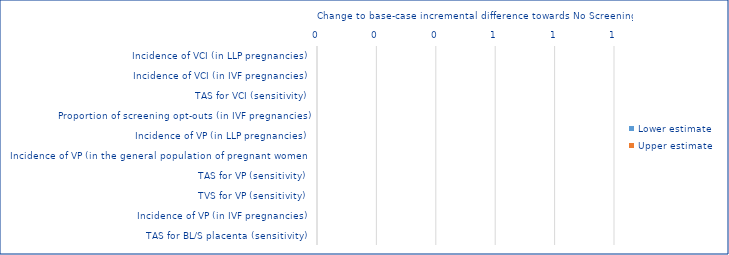
| Category | Lower estimate | Upper estimate |
|---|---|---|
| Incidence of VCI (in LLP pregnancies) | 0 | 0 |
| Incidence of VCI (in IVF pregnancies) | 0 | 0 |
| TAS for VCI (sensitivity) | 0 | 0 |
| Proportion of screening opt-outs (in IVF pregnancies) | 0 | 0 |
| Incidence of VP (in LLP pregnancies) | 0 | 0 |
| Incidence of VP (in the general population of pregnant women) | 0 | 0 |
| TAS for VP (sensitivity) | 0 | 0 |
| TVS for VP (sensitivity) | 0 | 0 |
| Incidence of VP (in IVF pregnancies) | 0 | 0 |
| TAS for BL/S placenta (sensitivity) | 0 | 0 |